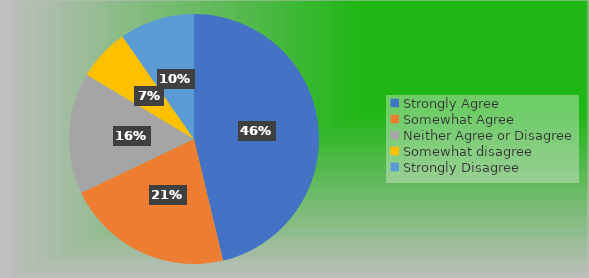
| Category | Series 0 |
|---|---|
| Strongly Agree | 62 |
| Somewhat Agree | 29 |
| Neither Agree or Disagree | 21 |
| Somewhat disagree | 9 |
| Strongly Disagree | 13 |